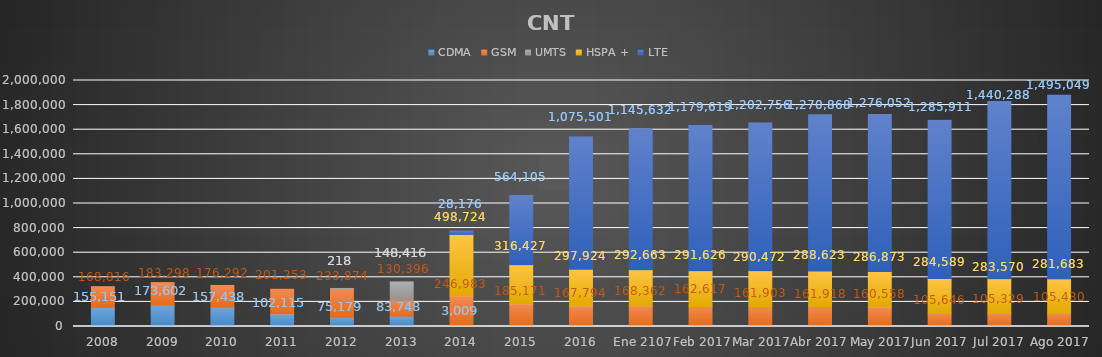
| Category | CDMA | GSM | UMTS | HSPA + | LTE |
|---|---|---|---|---|---|
| 2008 | 155151 | 168816 | 0 | 0 | 0 |
| 2009 | 173602 | 183298 | 0 | 0 | 0 |
| 2010 | 157438 | 176292 | 0 | 0 | 0 |
| 2011 | 102115 | 201253 | 0 | 0 | 0 |
| 2012 | 75179 | 233874 | 218 | 0 | 0 |
| 2013 | 83748 | 130396 | 148416 | 0 | 0 |
| 2014 | 3009 | 246983 | 0 | 498724 | 28176 |
| 2015 | 0 | 185171 | 0 | 316427 | 564105 |
| 2016 | 0 | 167794 | 0 | 297924 | 1075501 |
| Ene 2107 | 0 | 168362 | 0 | 292663 | 1145632 |
| Feb 2017 | 0 | 162617 | 0 | 291626 | 1179619 |
| Mar 2017 | 0 | 161903 | 0 | 290472 | 1202756 |
| Abr 2017 | 0 | 161918 | 0 | 288623 | 1270868 |
| May 2017 | 0 | 160558 | 0 | 286873 | 1276052 |
| Jun 2017 | 0 | 105646 | 0 | 284589 | 1285911 |
| Jul 2017 | 0 | 105329 | 0 | 283570 | 1440288 |
| Ago 2017 | 0 | 105430 | 0 | 281683 | 1495049 |